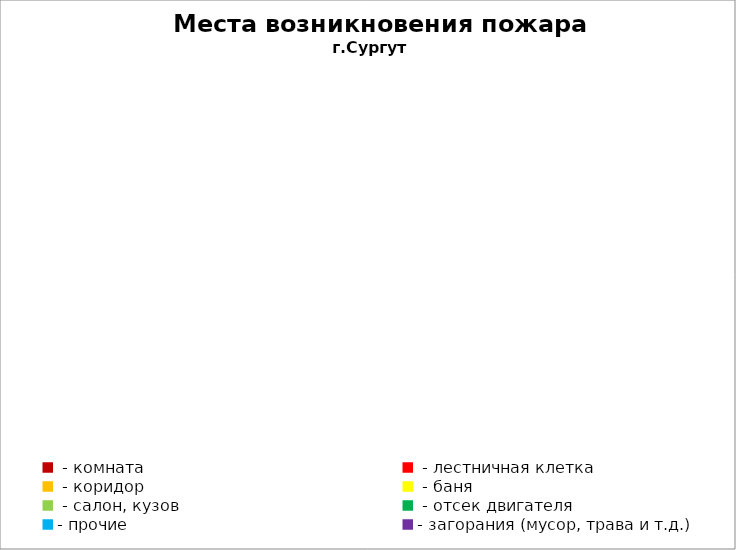
| Category | Места возникновения пожара |
|---|---|
|  - комната | 26 |
|  - лестничная клетка | 3 |
|  - коридор | 6 |
|  - баня | 6 |
|  - салон, кузов | 11 |
|  - отсек двигателя | 28 |
| - прочие | 70 |
| - загорания (мусор, трава и т.д.)  | 54 |